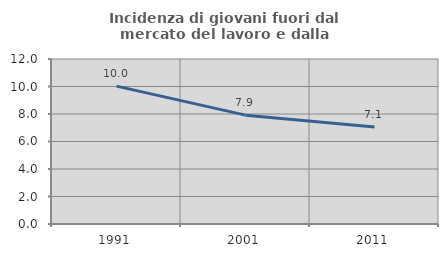
| Category | Incidenza di giovani fuori dal mercato del lavoro e dalla formazione  |
|---|---|
| 1991.0 | 10.026 |
| 2001.0 | 7.916 |
| 2011.0 | 7.053 |